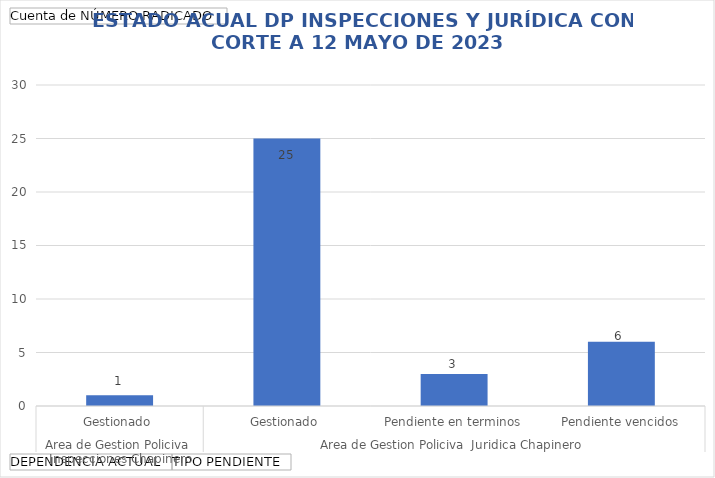
| Category | Total |
|---|---|
| 0 | 1 |
| 1 | 25 |
| 2 | 3 |
| 3 | 6 |